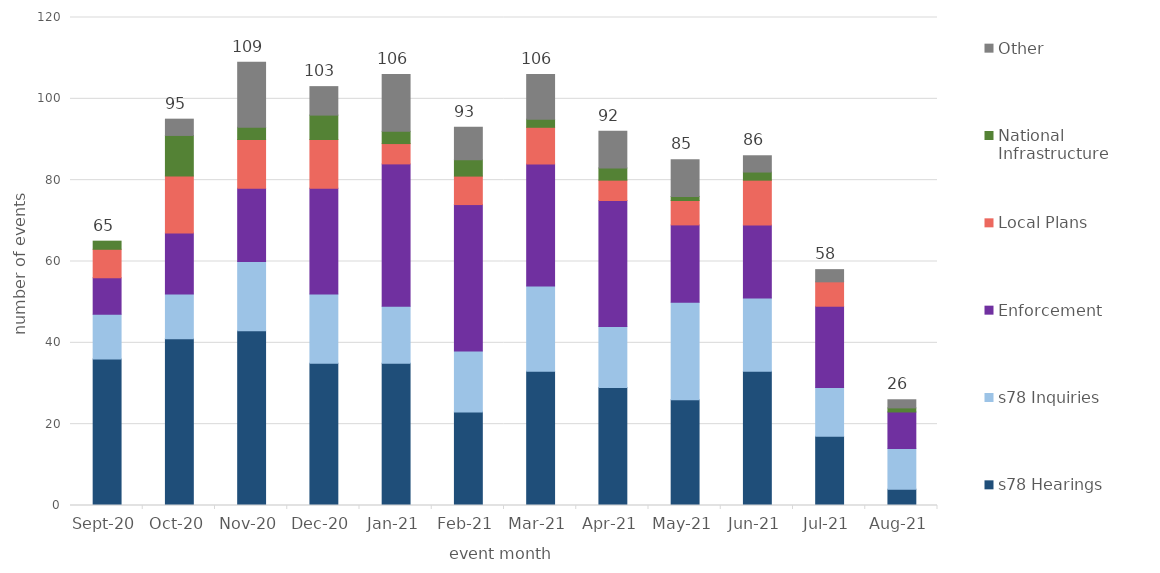
| Category | s78 Hearings | s78 Inquiries | Enforcement | Local Plans | National Infrastructure | Other |
|---|---|---|---|---|---|---|
| 2020-09-01 | 36 | 11 | 9 | 7 | 2 | 0 |
| 2020-10-01 | 41 | 11 | 15 | 14 | 10 | 4 |
| 2020-11-01 | 43 | 17 | 18 | 12 | 3 | 16 |
| 2020-12-01 | 35 | 17 | 26 | 12 | 6 | 7 |
| 2021-01-01 | 35 | 14 | 35 | 5 | 3 | 14 |
| 2021-02-01 | 23 | 15 | 36 | 7 | 4 | 8 |
| 2021-03-01 | 33 | 21 | 30 | 9 | 2 | 11 |
| 2021-04-01 | 29 | 15 | 31 | 5 | 3 | 9 |
| 2021-05-01 | 26 | 24 | 19 | 6 | 1 | 9 |
| 2021-06-01 | 33 | 18 | 18 | 11 | 2 | 4 |
| 2021-07-01 | 17 | 12 | 20 | 6 | 0 | 3 |
| 2021-08-01 | 4 | 10 | 9 | 0 | 1 | 2 |